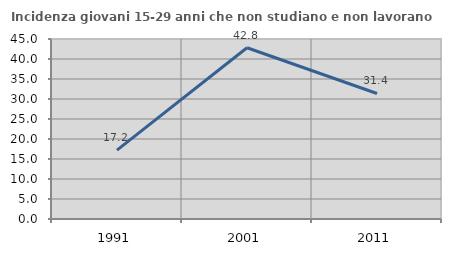
| Category | Incidenza giovani 15-29 anni che non studiano e non lavorano  |
|---|---|
| 1991.0 | 17.231 |
| 2001.0 | 42.818 |
| 2011.0 | 31.379 |